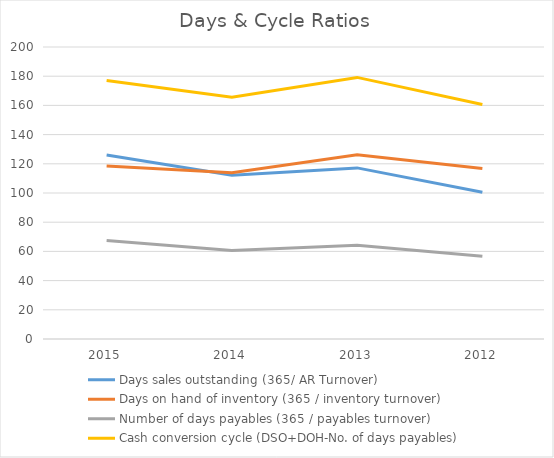
| Category | Days sales outstanding (365/ AR Turnover) | Days on hand of inventory (365 / inventory turnover) | Number of days payables (365 / payables turnover) | Cash conversion cycle (DSO+DOH-No. of days payables) |
|---|---|---|---|---|
| 2015.0 | 125.973 | 118.477 | 67.41 | 177.041 |
| 2014.0 | 112.244 | 113.951 | 60.645 | 165.55 |
| 2013.0 | 117.201 | 126.24 | 64.267 | 179.174 |
| 2012.0 | 100.541 | 116.706 | 56.636 | 160.611 |